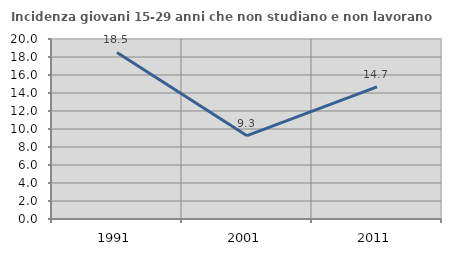
| Category | Incidenza giovani 15-29 anni che non studiano e non lavorano  |
|---|---|
| 1991.0 | 18.507 |
| 2001.0 | 9.259 |
| 2011.0 | 14.689 |